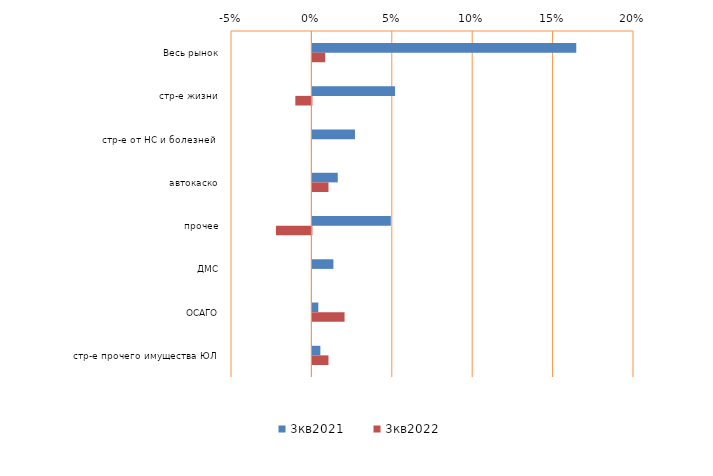
| Category | 3кв2021 | 3кв2022 |
|---|---|---|
| Весь рынок | 0.164 | 0.008 |
| стр-е жизни | 0.051 | -0.01 |
| стр-е от НС и болезней  | 0.026 | 0 |
| автокаско | 0.016 | 0.01 |
| прочее | 0.049 | -0.022 |
| ДМС | 0.013 | 0 |
| ОСАГО | 0.004 | 0.02 |
| стр-е прочего имущества ЮЛ | 0.005 | 0.01 |